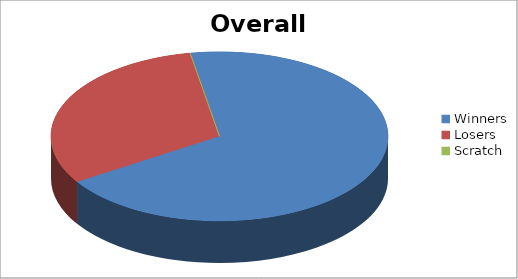
| Category | Series 1 |
|---|---|
| Winners | 22 |
| Losers | 10 |
| Scratch | 0 |